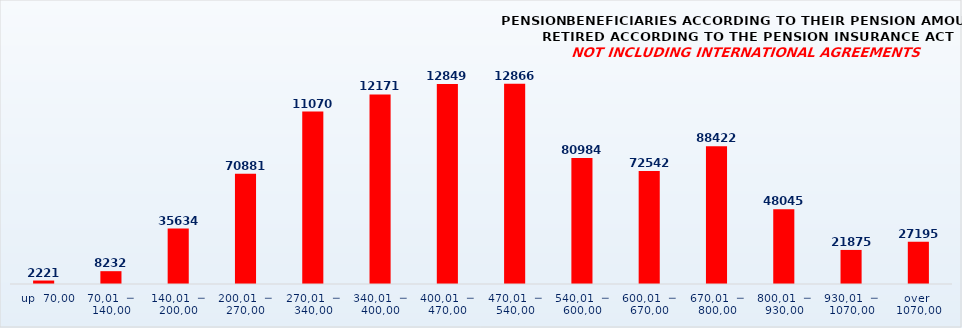
| Category | PENSION BENEFICIARIES ACCORDING TO TYPES AND AMOUNTS OF PENSION, RETIRED ACCORDING TO THE PENSION INSURANCE ACT
NOT INCLUDING INTERNATIONAL AGREEMENTS |
|---|---|
|   up  70,00 | 2221 |
| 70,01  ─  140,00 | 8232 |
| 140,01  ─  200,00 | 35634 |
| 200,01  ─  270,00 | 70881 |
| 270,01  ─  340,00 | 110706 |
| 340,01  ─  400,00 | 121711 |
| 400,01  ─  470,00 | 128493 |
| 470,01  ─  540,00 | 128666 |
| 540,01  ─  600,00 | 80984 |
| 600,01  ─  670,00 | 72542 |
| 670,01  ─  800,00 | 88422 |
| 800,01  ─  930,00 | 48045 |
| 930,01  ─  1070,00 | 21875 |
| over  1070,00 | 27195 |